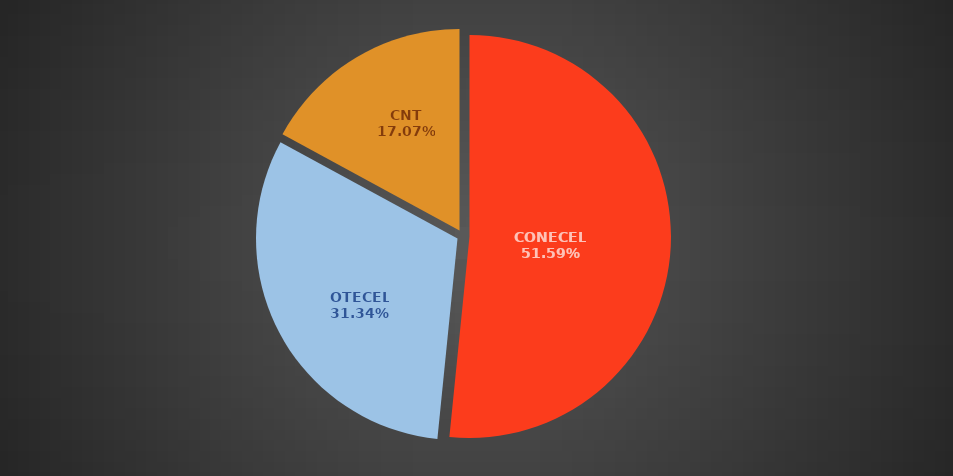
| Category | Feb 2022 |
|---|---|
| CONECEL | 8721942 |
| OTECEL | 5297948 |
| CNT | 2885948 |